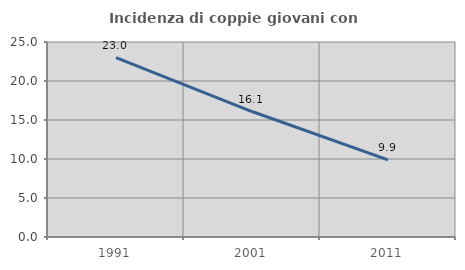
| Category | Incidenza di coppie giovani con figli |
|---|---|
| 1991.0 | 22.996 |
| 2001.0 | 16.086 |
| 2011.0 | 9.883 |